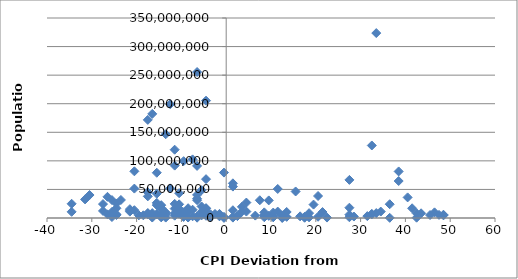
| Category | Population |
|---|---|
| 48.5 | 5707251 |
| 47.5 | 5488543 |
| 46.5 | 9875378 |
| 48.5 | 4691480 |
| 41.5 | 17000059 |
| 45.5 | 5214900 |
| 43.5 | 8211700 |
| 42.5 | 8211700 |
| 40.5 | 36048521 |
| 38.5 | 81459000 |
| 42.5 | 562958 |
| 38.5 | 64716000 |
| 36.5 | 24104700 |
| 36.5 | 332529 |
| 34.5 | 11250585 |
| 33.5 | 8662588 |
| 33.5 | 323625762 |
| 32.5 | 7234800 |
| 32.5 | 6378000 |
| 32.5 | 126919659 |
| 31.5 | 3324460 |
| 28.5 | 2545603 |
| 27.5 | 18006407 |
| 27.5 | 1315944 |
| 27.5 | 66689000 |
| 27.5 | 5779760 |
| 22.5 | 742737 |
| 20.5 | 2155784 |
| 21.5 | 10427301 |
| 20.5 | 38483957 |
| 19.5 | 23476640 |
| 18.5 | 1141166 |
| 18.5 | 8502900 |
| 16.5 | 2875593 |
| 17.5 | 2063077 |
| 15.5 | 46423064 |
| 13.5 | 10553443 |
| 11.5 | 50801405 |
| 17.5 | 445426 |
| 12.5 | 525000 |
| 12.5 | 4586353 |
| 13.5 | 1973700 |
| 12.5 | 92000 |
| 11.5 | 11262564 |
| 10.5 | 9531712 |
| 10.5 | 1261208 |
| 10.5 | 2113077 |
| 9.5 | 3720400 |
| 9.5 | 30770375 |
| 8.5 | 1343000 |
| 8.5 | 4284889 |
| 8.5 | 9855571 |
| 8.5 | 5426252 |
| 7.5 | 31068000 |
| 6.5 | 4187161 |
| 4.5 | 11238317 |
| 4.5 | 27000000 |
| 3.5 | 10955000 |
| 3.5 | 19511000 |
| 2.5 | 3286936 |
| 1.5 | 60674003 |
| 1.5 | 2067000 |
| 1.5 | 676872 |
| 1.5 | 13567338 |
| 1.5 | 54956900 |
| -0.5 | 190428 |
| -0.5 | 2069162 |
| -0.5 | 79463663 |
| -1.5 | 7202198 |
| -1.5 | 2950210 |
| -2.5 | 7041599 |
| -3.5 | 6377195 |
| -3.5 | 3081677 |
| -3.5 | 3929141 |
| -3.5 | 1349667 |
| -4.5 | 3871643 |
| -4.5 | 205338000 |
| -4.5 | 17322796 |
| -4.5 | 67959000 |
| -4.5 | 10982754 |
| -4.5 | 16212000 |
| -5.5 | 10879829 |
| -5.5 | 48663285 |
| -5.5 | 4503000 |
| -5.5 | 20277597 |
| -6.5 | 2886026 |
| -6.5 | 40400000 |
| -6.5 | 91162000 |
| -6.5 | 255461700 |
| -6.5 | 33848242 |
| -6.5 | 31151643 |
| -6.5 | 573311 |
| -7.5 | 2998600 |
| -7.5 | 14517176 |
| -11.5 | 119530753 |
| -7.5 | 102580000 |
| -8.5 | 11410651 |
| -8.5 | 828324 |
| -8.5 | 1475000 |
| -8.5 | 17138707 |
| -9.5 | 9980243 |
| -9.5 | 99465819 |
| -9.5 | 1859203 |
| -9.5 | 2913281 |
| -10.5 | 43417000 |
| -10.5 | 9498700 |
| -10.5 | 23919000 |
| -10.5 | 16144000 |
| -10.5 | 7552318 |
| -11.5 | 8249574 |
| -11.5 | 16407000 |
| -11.5 | 4067564 |
| -11.5 | 24692144 |
| -11.5 | 91700000 |
| -12.5 | 199085847 |
| -12.5 | 51820000 |
| -13.5 | 9754830 |
| -13.5 | 735554 |
| -13.5 | 146600000 |
| -13.5 | 6190280 |
| -14.5 | 1882450 |
| -14.5 | 15806675 |
| -14.5 | 17693500 |
| -14.5 | 6000000 |
| -14.5 | 4467000 |
| -14.5 | 22434363 |
| -14.5 | 1201542 |
| -15.5 | 22534532 |
| -15.5 | 79200000 |
| -15.5 | 26494504 |
| -15.5 | 6167237 |
| -15.5 | 6783272 |
| -15.5 | 42539010 |
| -16.5 | 798000 |
| -16.5 | 182202000 |
| -16.5 | 8610000 |
| -17.5 | 171700000 |
| -17.5 | 8746128 |
| -17.5 | 45010056 |
| -17.5 | 6803699 |
| -17.5 | 7059653 |
| -17.5 | 37873253 |
| -18.5 | 4709000 |
| -19.5 | 4662446 |
| -20.5 | 13670084 |
| -20.5 | 81680000 |
| -20.5 | 51486253 |
| -21.5 | 11178921 |
| -21.5 | 15458332 |
| -21.5 | 12973808 |
| -23.5 | 31576400 |
| -24.5 | 6380803 |
| -24.5 | 17064854 |
| -24.5 | 5171943 |
| -24.5 | 25408000 |
| -25.5 | 10604000 |
| -25.5 | 1693398 |
| -25.5 | 31416000 |
| -26.5 | 37056169 |
| -26.5 | 6411776 |
| -27.5 | 24383301 |
| -27.5 | 12340000 |
| -30.5 | 40235000 |
| -31.5 | 32564342 |
| -34.5 | 24895000 |
| -34.5 | 10816143 |